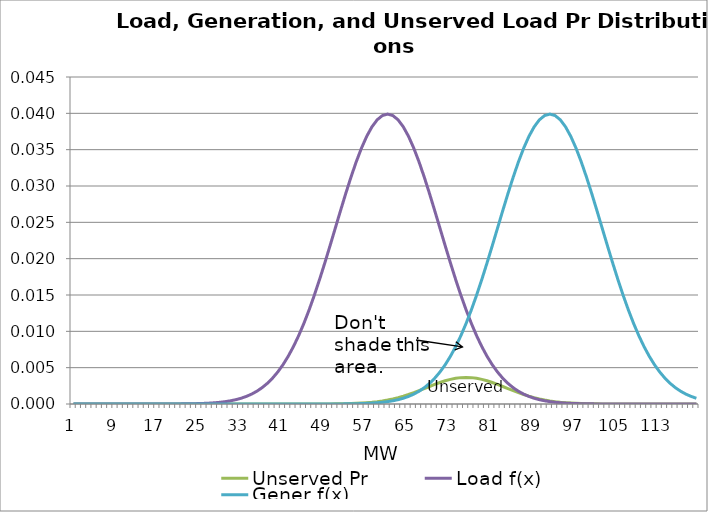
| Category | Unserved Pr | Load f(x) | Gener f(x) |
|---|---|---|---|
| 0 | 0 | 0 | 0 |
| 1 | 0 | 0 | 0 |
| 2 | 0 | 0 | 0 |
| 3 | 0 | 0 | 0 |
| 4 | 0 | 0 | 0 |
| 5 | 0 | 0 | 0 |
| 6 | 0 | 0 | 0 |
| 7 | 0 | 0 | 0 |
| 8 | 0 | 0 | 0 |
| 9 | 0 | 0 | 0 |
| 10 | 0 | 0 | 0 |
| 11 | 0 | 0 | 0 |
| 12 | 0 | 0 | 0 |
| 13 | 0 | 0 | 0 |
| 14 | 0 | 0 | 0 |
| 15 | 0 | 0 | 0 |
| 16 | 0 | 0 | 0 |
| 17 | 0 | 0 | 0 |
| 18 | 0 | 0 | 0 |
| 19 | 0 | 0 | 0 |
| 20 | 0 | 0 | 0 |
| 21 | 0 | 0 | 0 |
| 22 | 0 | 0 | 0 |
| 23 | 0 | 0 | 0 |
| 24 | 0 | 0 | 0 |
| 25 | 0 | 0 | 0 |
| 26 | 0 | 0 | 0 |
| 27 | 0 | 0 | 0 |
| 28 | 0 | 0 | 0 |
| 29 | 0 | 0 | 0 |
| 30 | 0 | 0 | 0 |
| 31 | 0 | 0.001 | 0 |
| 32 | 0 | 0.001 | 0 |
| 33 | 0 | 0.001 | 0 |
| 34 | 0 | 0.001 | 0 |
| 35 | 0 | 0.002 | 0 |
| 36 | 0 | 0.002 | 0 |
| 37 | 0 | 0.003 | 0 |
| 38 | 0 | 0.004 | 0 |
| 39 | 0 | 0.004 | 0 |
| 40 | 0 | 0.005 | 0 |
| 41 | 0 | 0.007 | 0 |
| 42 | 0 | 0.008 | 0 |
| 43 | 0 | 0.009 | 0 |
| 44 | 0 | 0.011 | 0 |
| 45 | 0 | 0.013 | 0 |
| 46 | 0 | 0.015 | 0 |
| 47 | 0 | 0.017 | 0 |
| 48 | 0 | 0.019 | 0 |
| 49 | 0 | 0.022 | 0 |
| 50 | 0 | 0.024 | 0 |
| 51 | 0 | 0.027 | 0 |
| 52 | 0 | 0.029 | 0 |
| 53 | 0 | 0.031 | 0 |
| 54 | 0 | 0.033 | 0 |
| 55 | 0 | 0.035 | 0 |
| 56 | 0 | 0.037 | 0 |
| 57 | 0 | 0.038 | 0 |
| 58 | 0 | 0.039 | 0 |
| 59 | 0 | 0.04 | 0 |
| 60 | 0.001 | 0.04 | 0 |
| 61 | 0.001 | 0.04 | 0 |
| 62 | 0.001 | 0.039 | 0.001 |
| 63 | 0.001 | 0.038 | 0.001 |
| 64 | 0.001 | 0.037 | 0.001 |
| 65 | 0.002 | 0.035 | 0.001 |
| 66 | 0.002 | 0.033 | 0.002 |
| 67 | 0.002 | 0.031 | 0.002 |
| 68 | 0.002 | 0.029 | 0.003 |
| 69 | 0.003 | 0.027 | 0.004 |
| 70 | 0.003 | 0.024 | 0.004 |
| 71 | 0.003 | 0.022 | 0.005 |
| 72 | 0.003 | 0.019 | 0.007 |
| 73 | 0.004 | 0.017 | 0.008 |
| 74 | 0.004 | 0.015 | 0.009 |
| 75 | 0.004 | 0.013 | 0.011 |
| 76 | 0.004 | 0.011 | 0.013 |
| 77 | 0.004 | 0.009 | 0.015 |
| 78 | 0.003 | 0.008 | 0.017 |
| 79 | 0.003 | 0.007 | 0.019 |
| 80 | 0.003 | 0.005 | 0.022 |
| 81 | 0.003 | 0.004 | 0.024 |
| 82 | 0.002 | 0.004 | 0.027 |
| 83 | 0.002 | 0.003 | 0.029 |
| 84 | 0.002 | 0.002 | 0.031 |
| 85 | 0.002 | 0.002 | 0.033 |
| 86 | 0.001 | 0.001 | 0.035 |
| 87 | 0.001 | 0.001 | 0.037 |
| 88 | 0.001 | 0.001 | 0.038 |
| 89 | 0.001 | 0.001 | 0.039 |
| 90 | 0.001 | 0 | 0.04 |
| 91 | 0 | 0 | 0.04 |
| 92 | 0 | 0 | 0.04 |
| 93 | 0 | 0 | 0.039 |
| 94 | 0 | 0 | 0.038 |
| 95 | 0 | 0 | 0.037 |
| 96 | 0 | 0 | 0.035 |
| 97 | 0 | 0 | 0.033 |
| 98 | 0 | 0 | 0.031 |
| 99 | 0 | 0 | 0.029 |
| 100 | 0 | 0 | 0.027 |
| 101 | 0 | 0 | 0.024 |
| 102 | 0 | 0 | 0.022 |
| 103 | 0 | 0 | 0.019 |
| 104 | 0 | 0 | 0.017 |
| 105 | 0 | 0 | 0.015 |
| 106 | 0 | 0 | 0.013 |
| 107 | 0 | 0 | 0.011 |
| 108 | 0 | 0 | 0.009 |
| 109 | 0 | 0 | 0.008 |
| 110 | 0 | 0 | 0.007 |
| 111 | 0 | 0 | 0.005 |
| 112 | 0 | 0 | 0.004 |
| 113 | 0 | 0 | 0.004 |
| 114 | 0 | 0 | 0.003 |
| 115 | 0 | 0 | 0.002 |
| 116 | 0 | 0 | 0.002 |
| 117 | 0 | 0 | 0.001 |
| 118 | 0 | 0 | 0.001 |
| 119 | 0 | 0 | 0.001 |